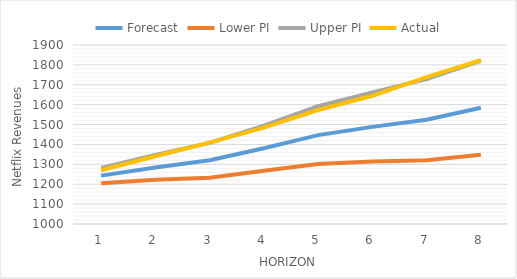
| Category | Forecast | Lower PI | Upper PI | Actual |
|---|---|---|---|---|
| 0 | 1243.24 | 1205.191 | 1281.289 | 1270.09 |
| 1 | 1284.481 | 1221.984 | 1346.979 | 1340.41 |
| 2 | 1320.269 | 1232.86 | 1407.679 | 1409.43 |
| 3 | 1381.018 | 1267.365 | 1494.671 | 1484.73 |
| 4 | 1446.999 | 1302.14 | 1591.857 | 1573.13 |
| 5 | 1488.24 | 1314.623 | 1661.857 | 1644.69 |
| 6 | 1524.028 | 1319.966 | 1728.091 | 1738.36 |
| 7 | 1584.777 | 1348.67 | 1820.883 | 1823.33 |